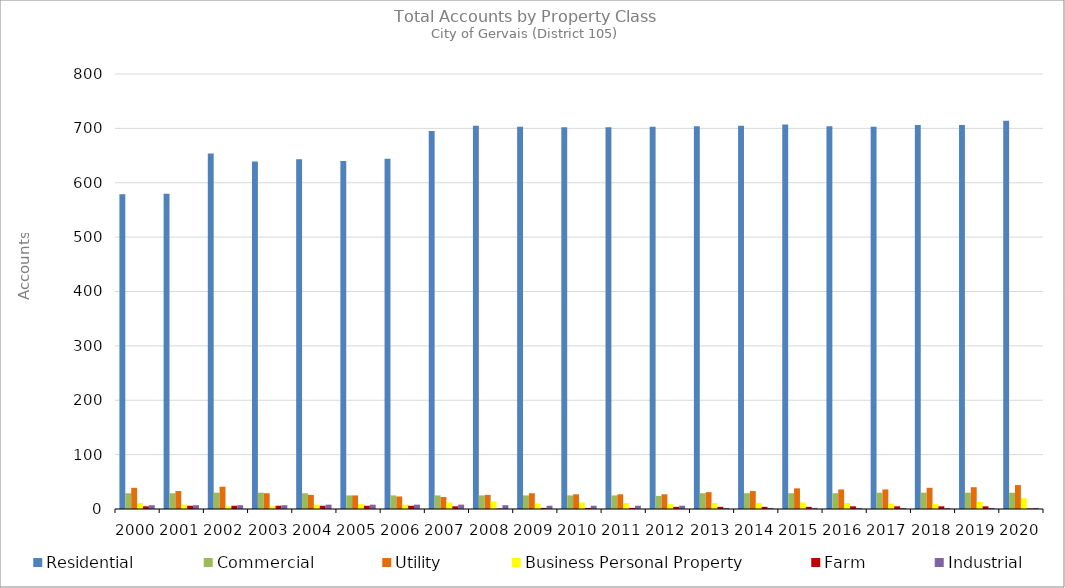
| Category | Residential | Commercial | Utility | Business Personal Property | Farm | Industrial |
|---|---|---|---|---|---|---|
| 2000.0 | 579 | 29 | 39 | 11 | 5 | 7 |
| 2001.0 | 580 | 29 | 33 | 8 | 6 | 7 |
| 2002.0 | 654 | 30 | 41 | 5 | 6 | 7 |
| 2003.0 | 639 | 30 | 29 | 5 | 6 | 7 |
| 2004.0 | 643 | 29 | 26 | 8 | 6 | 8 |
| 2005.0 | 640 | 25 | 25 | 9 | 6 | 8 |
| 2006.0 | 644 | 25 | 23 | 8 | 6 | 8 |
| 2007.0 | 695 | 25 | 22 | 12 | 5 | 8 |
| 2008.0 | 705 | 25 | 26 | 14 | 1 | 7 |
| 2009.0 | 703 | 25 | 29 | 10 | 2 | 6 |
| 2010.0 | 702 | 25 | 27 | 12 | 2 | 6 |
| 2011.0 | 702 | 25 | 27 | 11 | 2 | 6 |
| 2012.0 | 703 | 24 | 27 | 9 | 4 | 6 |
| 2013.0 | 704 | 29 | 31 | 11 | 4 | 2 |
| 2014.0 | 705 | 29 | 33 | 11 | 4 | 2 |
| 2015.0 | 707 | 29 | 38 | 12 | 4 | 2 |
| 2016.0 | 704 | 29 | 36 | 11 | 5 | 2 |
| 2017.0 | 703 | 30 | 36 | 10 | 5 | 2 |
| 2018.0 | 706 | 30 | 39 | 9 | 5 | 2 |
| 2019.0 | 706 | 30 | 40 | 13 | 5 | 2 |
| 2020.0 | 714 | 30 | 44 | 20 | 1 | 2 |